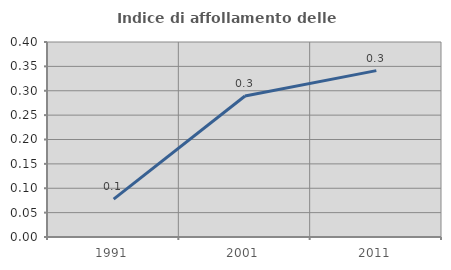
| Category | Indice di affollamento delle abitazioni  |
|---|---|
| 1991.0 | 0.078 |
| 2001.0 | 0.289 |
| 2011.0 | 0.341 |